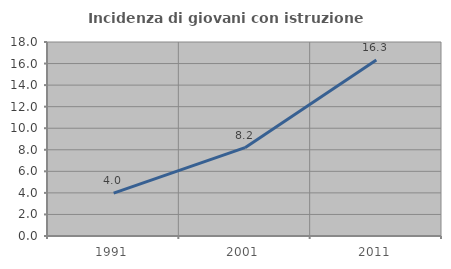
| Category | Incidenza di giovani con istruzione universitaria |
|---|---|
| 1991.0 | 3.977 |
| 2001.0 | 8.197 |
| 2011.0 | 16.327 |